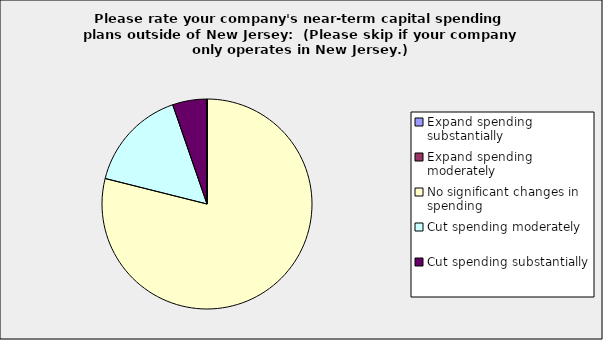
| Category | Series 0 |
|---|---|
| Expand spending substantially | 0 |
| Expand spending moderately | 0 |
| No significant changes in spending | 0.789 |
| Cut spending moderately | 0.158 |
| Cut spending substantially | 0.053 |